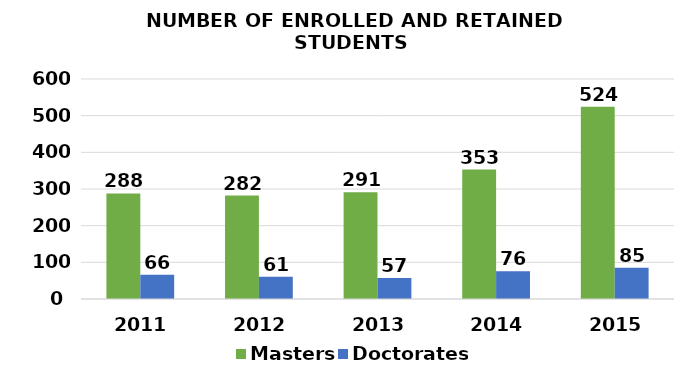
| Category | Masters | Doctorates |
|---|---|---|
| 2011.0 | 288 | 66 |
| 2012.0 | 282 | 61 |
| 2013.0 | 291 | 57 |
| 2014.0 | 353 | 76 |
| 2015.0 | 524 | 85 |